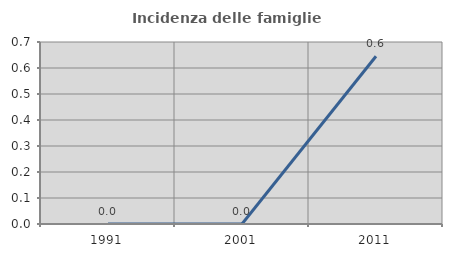
| Category | Incidenza delle famiglie numerose |
|---|---|
| 1991.0 | 0 |
| 2001.0 | 0 |
| 2011.0 | 0.645 |